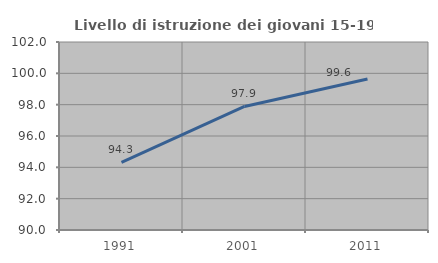
| Category | Livello di istruzione dei giovani 15-19 anni |
|---|---|
| 1991.0 | 94.322 |
| 2001.0 | 97.887 |
| 2011.0 | 99.638 |